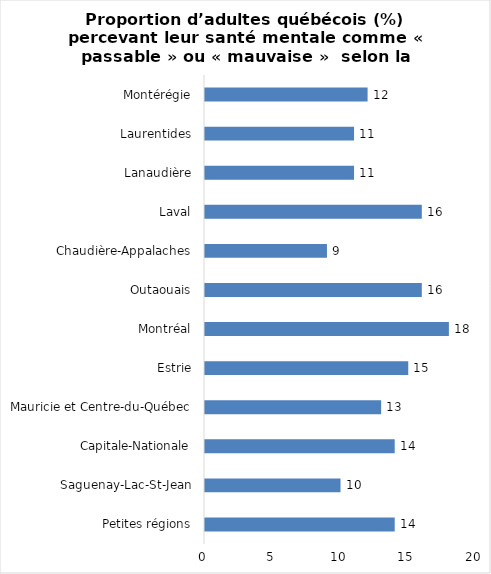
| Category | Series 0 |
|---|---|
| Petites régions | 14 |
| Saguenay-Lac-St-Jean | 10 |
| Capitale-Nationale | 14 |
| Mauricie et Centre-du-Québec | 13 |
| Estrie | 15 |
| Montréal | 18 |
| Outaouais | 16 |
| Chaudière-Appalaches | 9 |
| Laval | 16 |
| Lanaudière | 11 |
| Laurentides | 11 |
| Montérégie | 12 |